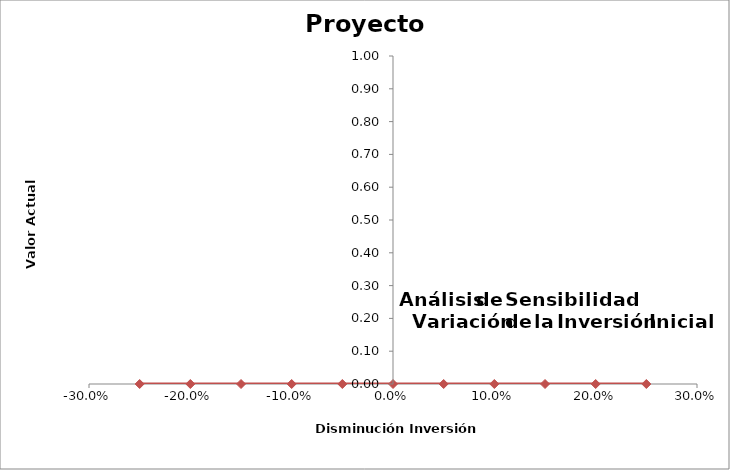
| Category | Series 0 |
|---|---|
| -0.25 | 0 |
| -0.2 | 0 |
| -0.15 | 0 |
| -0.1 | 0 |
| -0.05 | 0 |
| 0.0 | 0 |
| 0.05 | 0 |
| 0.1 | 0 |
| 0.15 | 0 |
| 0.2 | 0 |
| 0.25 | 0 |